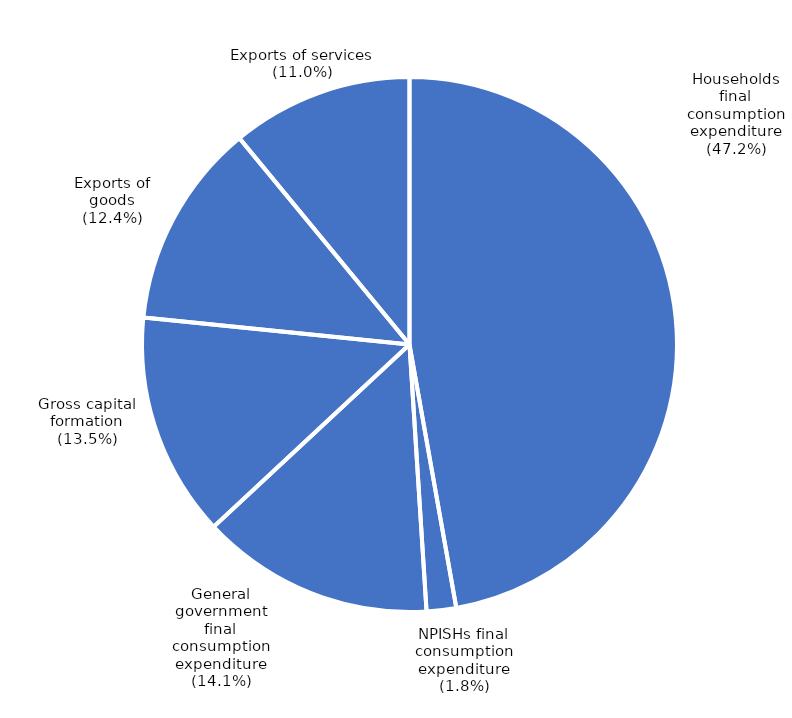
| Category | Series 0 |
|---|---|
| Households
final
consumption
expenditure | 1335216 |
| NPISHs final
consumption
expenditure | 50475 |
| General
government
final
consumption
expenditure | 398421 |
| Gross capital
formation | 383167 |
| Exports of
goods | 351132 |
| Exports of services | 310469 |